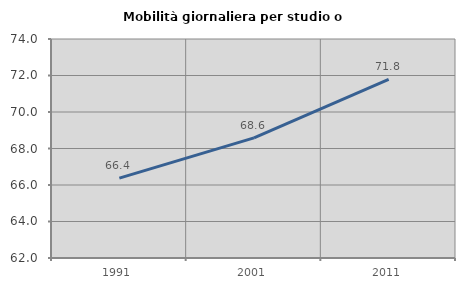
| Category | Mobilità giornaliera per studio o lavoro |
|---|---|
| 1991.0 | 66.38 |
| 2001.0 | 68.579 |
| 2011.0 | 71.782 |